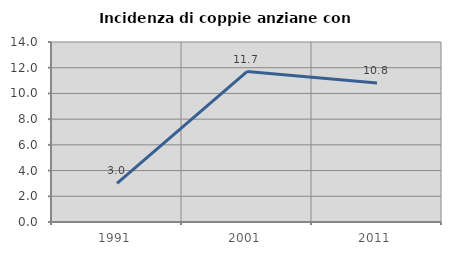
| Category | Incidenza di coppie anziane con figli |
|---|---|
| 1991.0 | 3 |
| 2001.0 | 11.702 |
| 2011.0 | 10.811 |